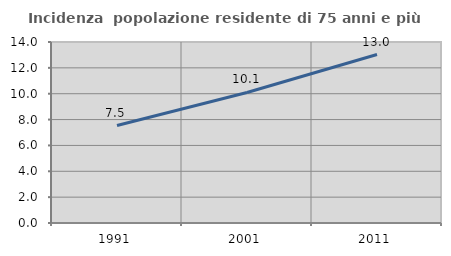
| Category | Incidenza  popolazione residente di 75 anni e più |
|---|---|
| 1991.0 | 7.541 |
| 2001.0 | 10.096 |
| 2011.0 | 13.03 |